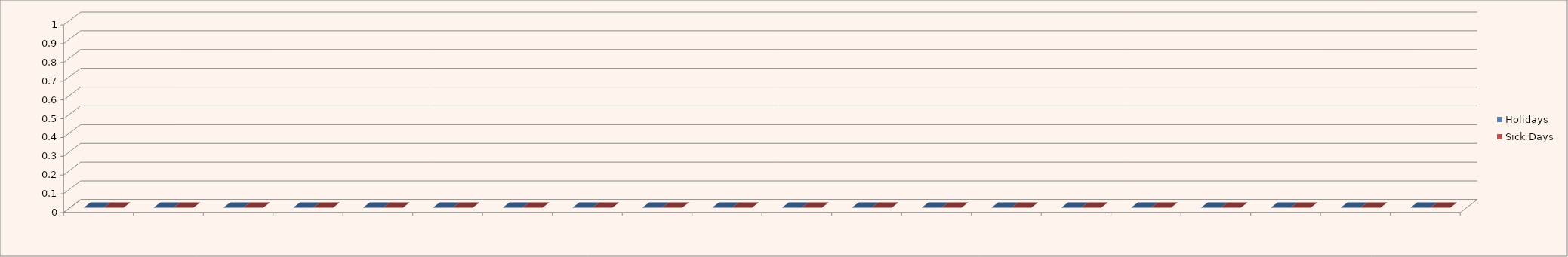
| Category | Holidays | Sick Days |
|---|---|---|
| 0 | 0 | 0 |
| 1 | 0 | 0 |
| 2 | 0 | 0 |
| 3 | 0 | 0 |
| 4 | 0 | 0 |
| 5 | 0 | 0 |
| 6 | 0 | 0 |
| 7 | 0 | 0 |
| 8 | 0 | 0 |
| 9 | 0 | 0 |
| 10 | 0 | 0 |
| 11 | 0 | 0 |
| 12 | 0 | 0 |
| 13 | 0 | 0 |
| 14 | 0 | 0 |
| 15 | 0 | 0 |
| 16 | 0 | 0 |
| 17 | 0 | 0 |
| 18 | 0 | 0 |
| 19 | 0 | 0 |